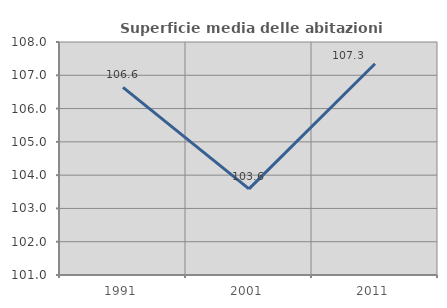
| Category | Superficie media delle abitazioni occupate |
|---|---|
| 1991.0 | 106.635 |
| 2001.0 | 103.589 |
| 2011.0 | 107.346 |